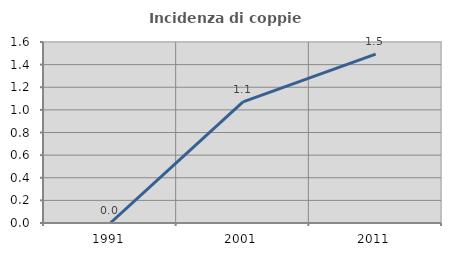
| Category | Incidenza di coppie miste |
|---|---|
| 1991.0 | 0 |
| 2001.0 | 1.071 |
| 2011.0 | 1.493 |